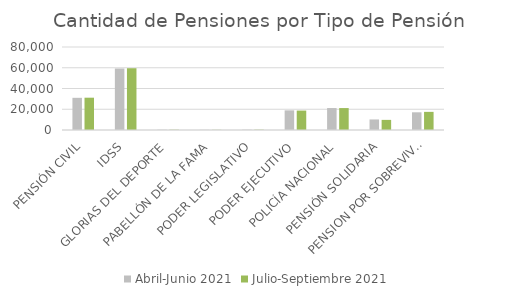
| Category | Abril-Junio 2021 | Julio-Septiembre 2021 |
|---|---|---|
| PENSIÓN CIVIL | 31019 | 31137 |
| IDSS | 59255 | 59538 |
| GLORIAS DEL DEPORTE | 276 | 272 |
| PABELLÓN DE LA FAMA | 164 | 165 |
| PODER LEGISLATIVO | 304 | 291 |
| PODER EJECUTIVO | 18929 | 18719 |
| POLICÍA NACIONAL | 21161 | 21144 |
| PENSIÓN SOLIDARIA | 10167 | 9753 |
| PENSION POR SOBREVIVENCIA | 17066 | 17481 |